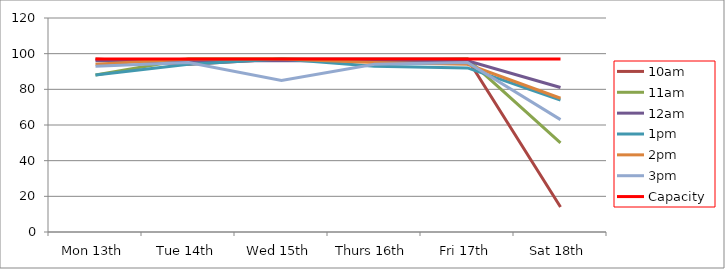
| Category | 9am | 10am | 11am | 12am | 1pm | 2pm | 3pm | 4pm | 5pm | Capacity |
|---|---|---|---|---|---|---|---|---|---|---|
| Mon 13th |  | 97 | 88 | 96 | 88 | 94 | 93 |  |  | 97 |
| Tue 14th |  | 94 | 97 | 96 | 94 | 97 | 95 |  |  | 97 |
| Wed 15th |  | 97 | 97 | 96 | 97 | 97 | 85 |  |  | 97 |
| Thurs 16th |  | 97 | 96 | 96 | 93 | 95 | 94 |  |  | 97 |
| Fri 17th |  | 97 | 97 | 96 | 92 | 94 | 95 |  |  | 97 |
| Sat 18th |  | 14 | 50 | 81 | 74 | 75 | 63 |  |  | 97 |